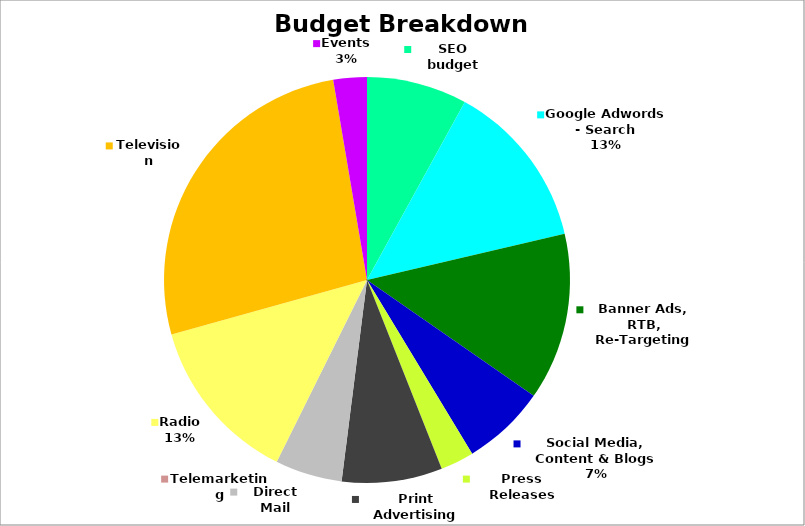
| Category | Annual Detail |
|---|---|
| SEO budget | 36000 |
| Google Adwords - Search | 60000 |
| Banner Ads, RTB, Re-Targeting | 60000 |
| Social Media, Content & Blogs | 30000 |
| Press Releases | 12000 |
| Print Advertising | 36000 |
| Direct Mail | 24000 |
| Telemarketing | 0 |
| Radio | 60000 |
| Television | 120000 |
| Events | 12000 |